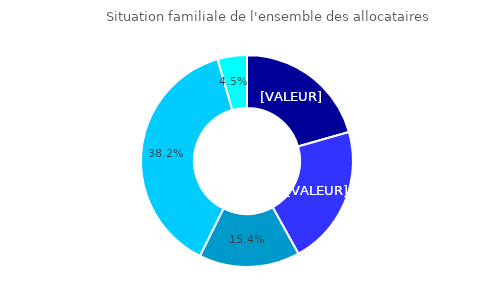
| Category | Situation familiale de l'ensemble des allocataires  |
|---|---|
| Femme isolée | 0.206 |
| Homme isolé | 0.213 |
| Monoparent  | 0.154 |
| Couple avec enfant(s) | 0.382 |
| Couple sans enfant | 0.045 |